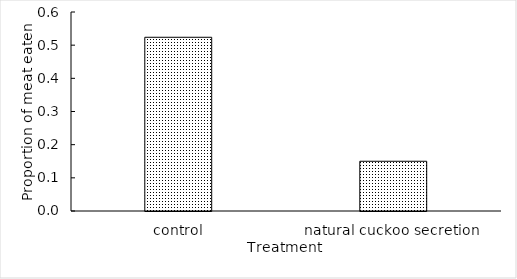
| Category | Series 0 |
|---|---|
| control | 0.524 |
| natural cuckoo secretion | 0.15 |